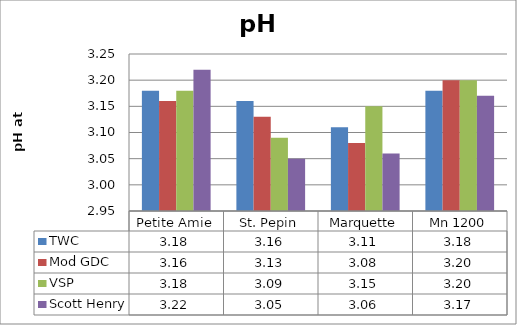
| Category | TWC | Mod GDC | VSP | Scott Henry |
|---|---|---|---|---|
| 0 | 3.18 | 3.16 | 3.18 | 3.22 |
| 1 | 3.16 | 3.13 | 3.09 | 3.05 |
| 2 | 3.11 | 3.08 | 3.15 | 3.06 |
| 3 | 3.18 | 3.2 | 3.2 | 3.17 |